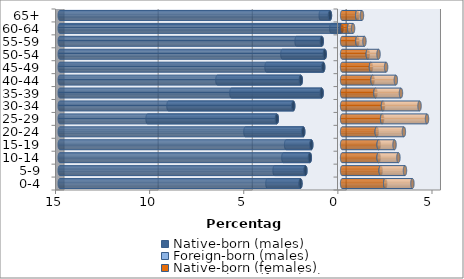
| Category | Native-born (males) | Foreign-born (males) | Native-born (females) | Foreign-born (females) |
|---|---|---|---|---|
| 0-4 | -2.214 | -1.755 | 2.289 | 1.445 |
| 5-9 | -1.951 | -1.637 | 2.047 | 1.292 |
| 10-14 | -1.715 | -1.407 | 1.938 | 1.054 |
| 15-19 | -1.639 | -1.335 | 1.942 | 0.842 |
| 20-24 | -2.065 | -3.072 | 1.838 | 1.443 |
| 25-29 | -3.468 | -6.868 | 2.124 | 2.386 |
| 30-34 | -2.597 | -6.627 | 2.17 | 1.943 |
| 35-39 | -1.087 | -4.794 | 1.77 | 1.355 |
| 40-44 | -2.194 | -4.433 | 1.616 | 1.239 |
| 45-49 | -1.005 | -3.011 | 1.532 | 0.804 |
| 50-54 | -0.924 | -2.249 | 1.364 | 0.571 |
| 55-59 | -1.081 | -1.338 | 0.81 | 0.376 |
| 60-64 | -0.042 | -0.533 | 0.378 | 0.204 |
| 65+ | -0.648 | -0.489 | 0.803 | 0.251 |